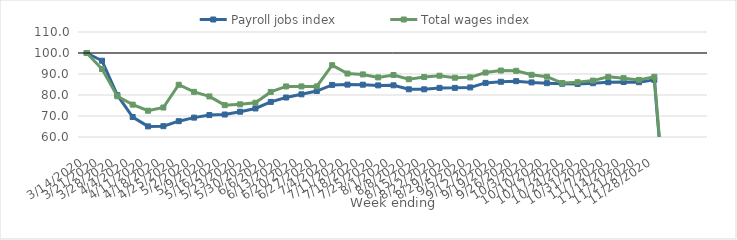
| Category | Payroll jobs index | Total wages index |
|---|---|---|
| 14/03/2020 | 100 | 100 |
| 21/03/2020 | 96.32 | 92.36 |
| 28/03/2020 | 79.914 | 79.417 |
| 04/04/2020 | 69.51 | 75.402 |
| 11/04/2020 | 65.055 | 72.521 |
| 18/04/2020 | 65.152 | 74.037 |
| 25/04/2020 | 67.541 | 84.88 |
| 02/05/2020 | 69.219 | 81.508 |
| 09/05/2020 | 70.459 | 79.327 |
| 16/05/2020 | 70.704 | 75.16 |
| 23/05/2020 | 72.041 | 75.552 |
| 30/05/2020 | 73.585 | 76.3 |
| 06/06/2020 | 76.711 | 81.459 |
| 13/06/2020 | 78.804 | 84.082 |
| 20/06/2020 | 80.327 | 84.082 |
| 27/06/2020 | 81.88 | 84.081 |
| 04/07/2020 | 84.811 | 94.193 |
| 11/07/2020 | 84.943 | 90.218 |
| 18/07/2020 | 84.905 | 89.8 |
| 25/07/2020 | 84.582 | 88.372 |
| 01/08/2020 | 84.62 | 89.538 |
| 08/08/2020 | 82.717 | 87.502 |
| 15/08/2020 | 82.704 | 88.545 |
| 22/08/2020 | 83.384 | 89.182 |
| 29/08/2020 | 83.395 | 88.227 |
| 05/09/2020 | 83.614 | 88.402 |
| 12/09/2020 | 85.763 | 90.671 |
| 19/09/2020 | 86.302 | 91.633 |
| 26/09/2020 | 86.588 | 91.515 |
| 03/10/2020 | 85.993 | 89.612 |
| 10/10/2020 | 85.635 | 88.703 |
| 17/10/2020 | 85.356 | 85.707 |
| 24/10/2020 | 85.267 | 86.091 |
| 31/10/2020 | 85.615 | 86.853 |
| 07/11/2020 | 86.073 | 88.654 |
| 14/11/2020 | 86.192 | 88.015 |
| 21/11/2020 | 86.101 | 87.191 |
| 28/11/2020 | 87.2 | 88.706 |